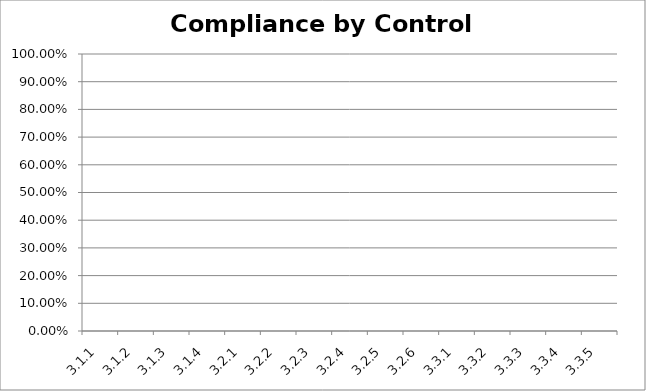
| Category | Compliance |
|---|---|
| 3.1.1 | 0 |
| 3.1.2 | 0 |
| 3.1.3 | 0 |
| 3.1.4 | 0 |
| 3.2.1 | 0 |
| 3.2.2 | 0 |
| 3.2.3 | 0 |
| 3.2.4 | 0 |
| 3.2.5 | 0 |
| 3.2.6 | 0 |
| 3.3.1 | 0 |
| 3.3.2 | 0 |
| 3.3.3 | 0 |
| 3.3.4 | 0 |
| 3.3.5 | 0 |